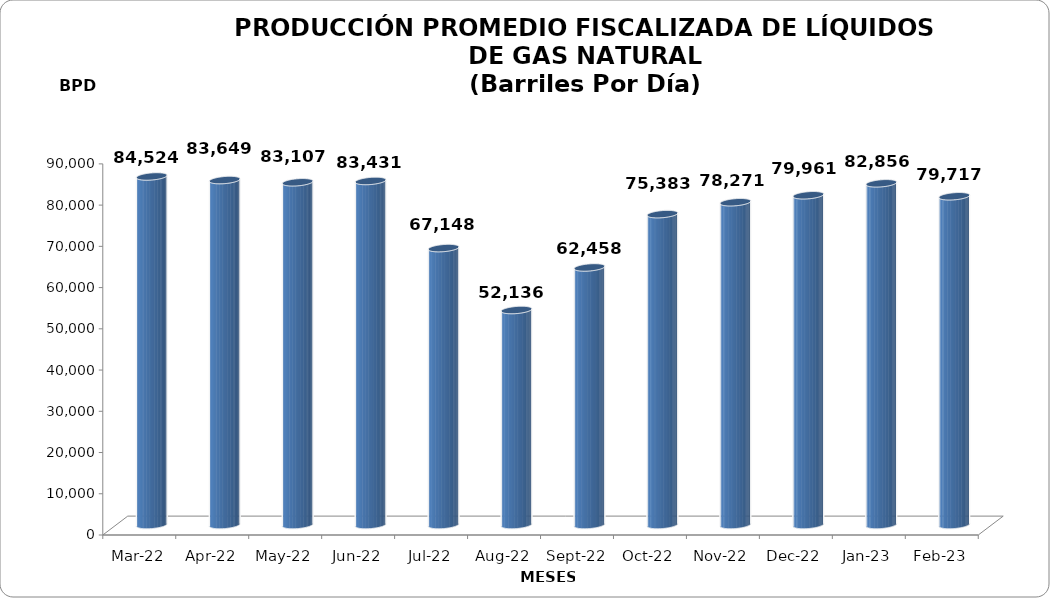
| Category | Series 0 |
|---|---|
| 2022-03-01 | 84523.548 |
| 2022-04-01 | 83649 |
| 2022-05-01 | 83107.387 |
| 2022-06-01 | 83430.867 |
| 2022-07-01 | 67147.806 |
| 2022-08-01 | 52135.548 |
| 2022-09-01 | 62458.2 |
| 2022-10-01 | 75383.161 |
| 2022-11-01 | 78270.633 |
| 2022-12-01 | 79961.258 |
| 2023-01-01 | 82856.355 |
| 2023-02-01 | 79716.536 |